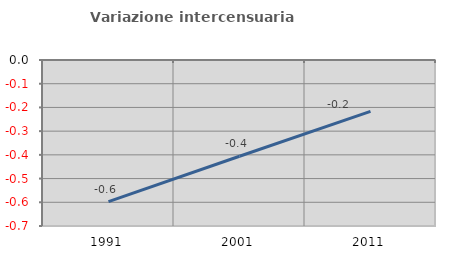
| Category | Variazione intercensuaria annua |
|---|---|
| 1991.0 | -0.597 |
| 2001.0 | -0.406 |
| 2011.0 | -0.216 |